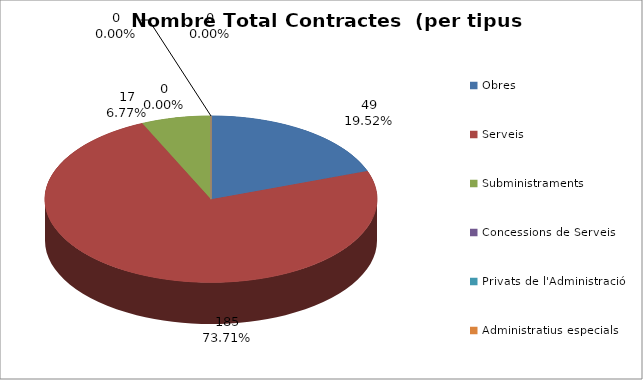
| Category | Nombre Total Contractes |
|---|---|
| Obres | 49 |
| Serveis | 185 |
| Subministraments | 17 |
| Concessions de Serveis | 0 |
| Privats de l'Administració | 0 |
| Administratius especials | 0 |